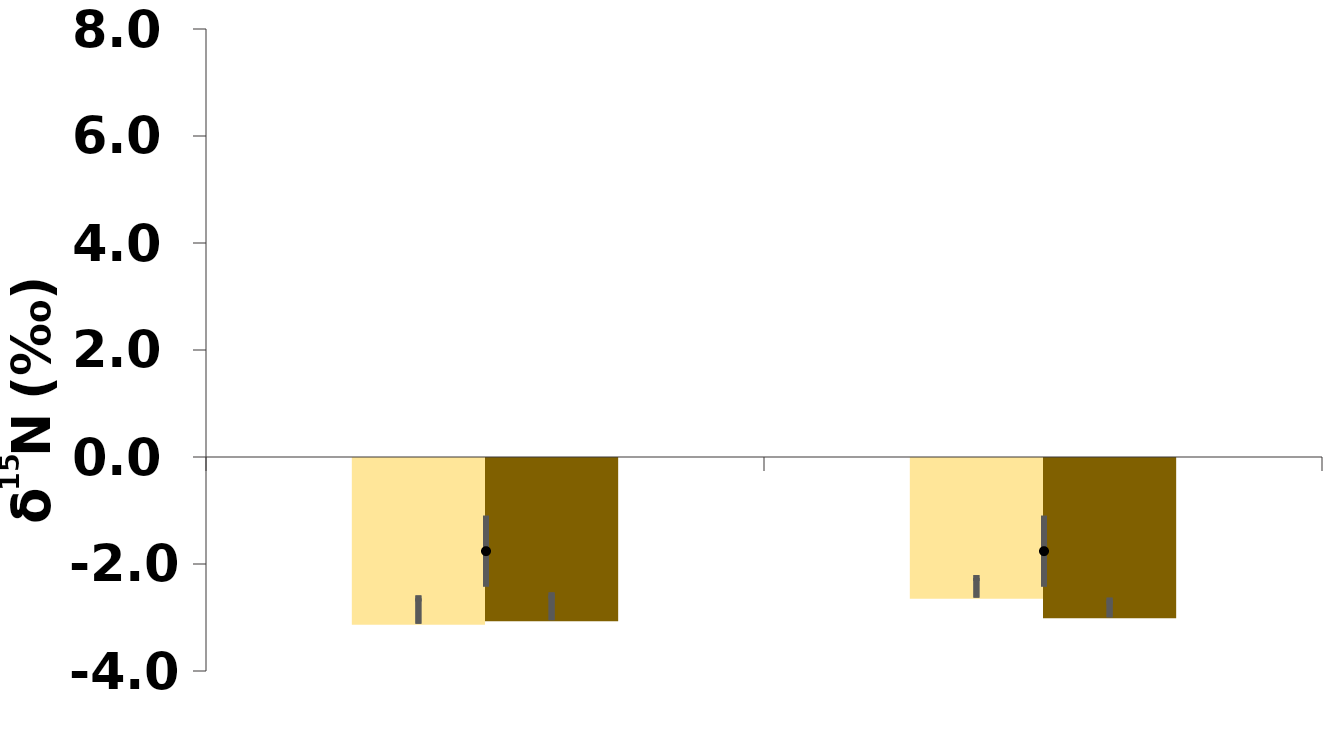
| Category | Root | Shoot |
|---|---|---|
| 0.0 | -3.116 | -3.05 |
| 0.0 | -2.629 | -2.998 |